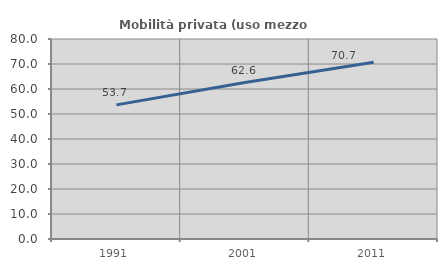
| Category | Mobilità privata (uso mezzo privato) |
|---|---|
| 1991.0 | 53.651 |
| 2001.0 | 62.598 |
| 2011.0 | 70.731 |